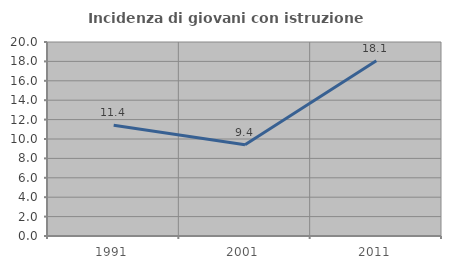
| Category | Incidenza di giovani con istruzione universitaria |
|---|---|
| 1991.0 | 11.429 |
| 2001.0 | 9.402 |
| 2011.0 | 18.072 |